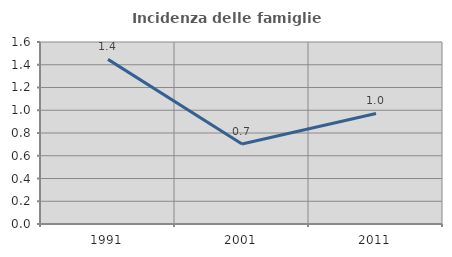
| Category | Incidenza delle famiglie numerose |
|---|---|
| 1991.0 | 1.447 |
| 2001.0 | 0.703 |
| 2011.0 | 0.972 |